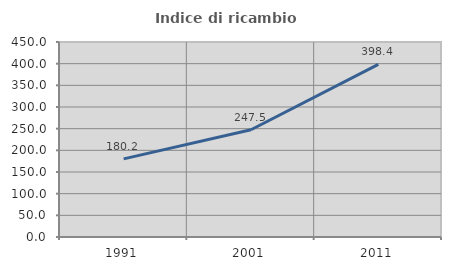
| Category | Indice di ricambio occupazionale  |
|---|---|
| 1991.0 | 180.233 |
| 2001.0 | 247.5 |
| 2011.0 | 398.361 |